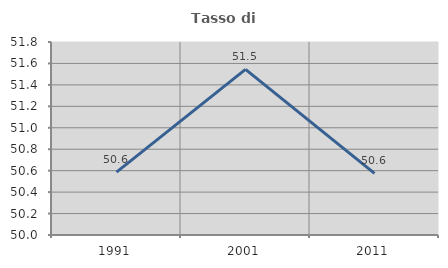
| Category | Tasso di occupazione   |
|---|---|
| 1991.0 | 50.586 |
| 2001.0 | 51.545 |
| 2011.0 | 50.575 |